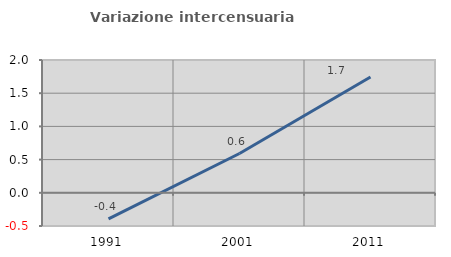
| Category | Variazione intercensuaria annua |
|---|---|
| 1991.0 | -0.392 |
| 2001.0 | 0.592 |
| 2011.0 | 1.743 |